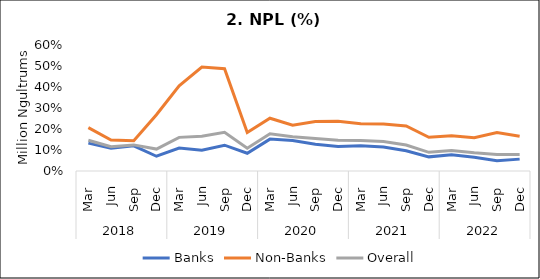
| Category | Banks | Non-Banks | Overall | Threshold |
|---|---|---|---|---|
| 0 | 0.133 | 0.207 | 0.146 |  |
| 1 | 0.108 | 0.148 | 0.115 |  |
| 2 | 0.12 | 0.144 | 0.124 |  |
| 3 | 0.07 | 0.268 | 0.104 |  |
| 4 | 0.109 | 0.406 | 0.16 |  |
| 5 | 0.099 | 0.495 | 0.165 |  |
| 6 | 0.123 | 0.487 | 0.184 |  |
| 7 | 0.084 | 0.183 | 0.109 |  |
| 8 | 0.152 | 0.251 | 0.177 |  |
| 9 | 0.145 | 0.218 | 0.164 |  |
| 10 | 0.128 | 0.235 | 0.154 |  |
| 11 | 0.117 | 0.237 | 0.146 |  |
| 12 | 0.121 | 0.226 | 0.146 |  |
| 13 | 0.115 | 0.224 | 0.141 |  |
| 14 | 0.096 | 0.214 | 0.124 |  |
| 15 | 0.067 | 0.16 | 0.089 |  |
| 16 | 0.077 | 0.168 | 0.098 |  |
| 17 | 0.065 | 0.158 | 0.086 |  |
| 18 | 0.049 | 0.183 | 0.078 |  |
| 19 | 0.057 | 0.165 | 0.079 |  |